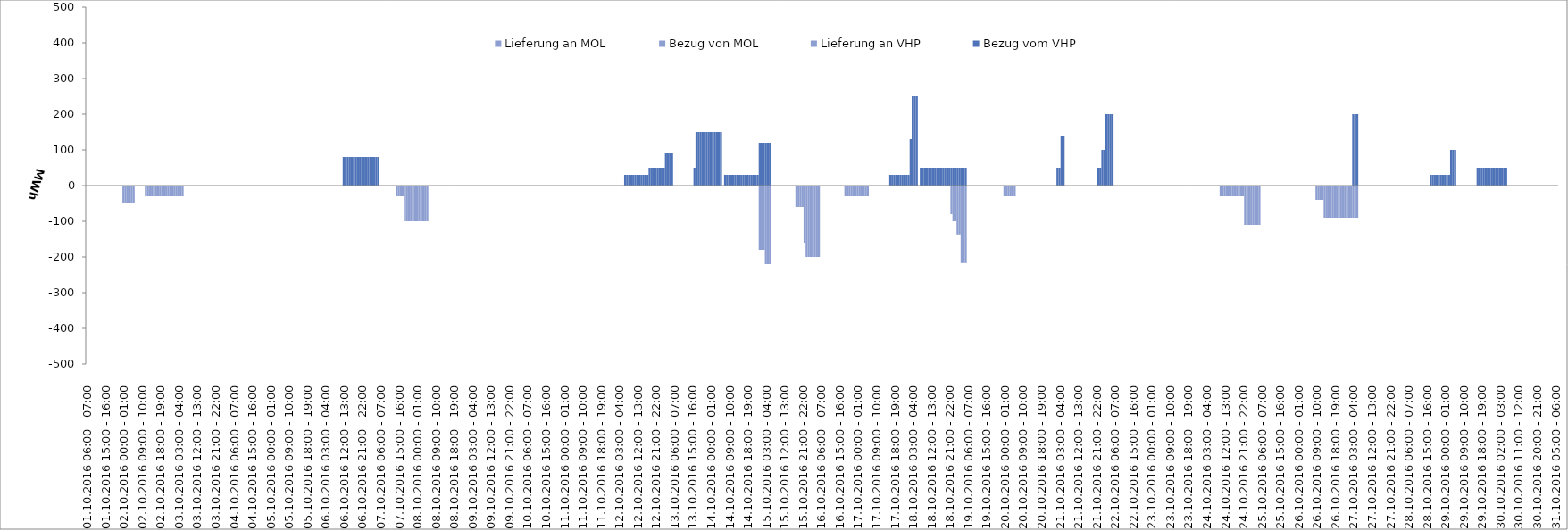
| Category | Bezug vom VHP | Lieferung an VHP | Bezug von MOL | Lieferung an MOL |
|---|---|---|---|---|
| 01.10.2016 06:00 - 07:00 | 0 | 0 | 0 | 0 |
| 01.10.2016 07:00 - 08:00 | 0 | 0 | 0 | 0 |
| 01.10.2016 08:00 - 09:00 | 0 | 0 | 0 | 0 |
| 01.10.2016 09:00 - 10:00 | 0 | 0 | 0 | 0 |
| 01.10.2016 10:00 - 11:00 | 0 | 0 | 0 | 0 |
| 01.10.2016 11:00 - 12:00 | 0 | 0 | 0 | 0 |
| 01.10.2016 12:00 - 13:00 | 0 | 0 | 0 | 0 |
| 01.10.2016 13:00 - 14:00 | 0 | 0 | 0 | 0 |
| 01.10.2016 14:00 - 15:00 | 0 | 0 | 0 | 0 |
| 01.10.2016 15:00 - 16:00 | 0 | 0 | 0 | 0 |
| 01.10.2016 16:00 - 17:00 | 0 | 0 | 0 | 0 |
| 01.10.2016 17:00 - 18:00 | 0 | 0 | 0 | 0 |
| 01.10.2016 18:00 - 19:00 | 0 | 0 | 0 | 0 |
| 01.10.2016 19:00 - 20:00 | 0 | 0 | 0 | 0 |
| 01.10.2016 20:00 - 21:00 | 0 | 0 | 0 | 0 |
| 01.10.2016 21:00 - 22:00 | 0 | 0 | 0 | 0 |
| 01.10.2016 22:00 - 23:00 | 0 | 0 | 0 | 0 |
| 01.10.2016 23:00 - 24:00 | 0 | 0 | 0 | 0 |
| 02.10.2016 00:00 - 01:00 | 0 | -50 | 0 | 0 |
| 02.10.2016 01:00 - 02:00 | 0 | -50 | 0 | 0 |
| 02.10.2016 02:00 - 03:00 | 0 | -50 | 0 | 0 |
| 02.10.2016 03:00 - 04:00 | 0 | -50 | 0 | 0 |
| 02.10.2016 04:00 - 05:00 | 0 | -50 | 0 | 0 |
| 02.10.2016 05:00 - 06:00 | 0 | -50 | 0 | 0 |
| 02.10.2016 06:00 - 07:00 | 0 | 0 | 0 | 0 |
| 02.10.2016 07:00 - 08:00 | 0 | 0 | 0 | 0 |
| 02.10.2016 08:00 - 09:00 | 0 | 0 | 0 | 0 |
| 02.10.2016 09:00 - 10:00 | 0 | 0 | 0 | 0 |
| 02.10.2016 10:00 - 11:00 | 0 | 0 | 0 | 0 |
| 02.10.2016 11:00 - 12:00 | 0 | -30 | 0 | 0 |
| 02.10.2016 12:00 - 13:00 | 0 | -30 | 0 | 0 |
| 02.10.2016 13:00 - 14:00 | 0 | -30 | 0 | 0 |
| 02.10.2016 14:00 - 15:00 | 0 | -30 | 0 | 0 |
| 02.10.2016 15:00 - 16:00 | 0 | -30 | 0 | 0 |
| 02.10.2016 16:00 - 17:00 | 0 | -30 | 0 | 0 |
| 02.10.2016 17:00 - 18:00 | 0 | -30 | 0 | 0 |
| 02.10.2016 18:00 - 19:00 | 0 | -30 | 0 | 0 |
| 02.10.2016 19:00 - 20:00 | 0 | -30 | 0 | 0 |
| 02.10.2016 20:00 - 21:00 | 0 | -30 | 0 | 0 |
| 02.10.2016 21:00 - 22:00 | 0 | -30 | 0 | 0 |
| 02.10.2016 22:00 - 23:00 | 0 | -30 | 0 | 0 |
| 02.10.2016 23:00 - 24:00 | 0 | -30 | 0 | 0 |
| 03.10.2016 00:00 - 01:00 | 0 | -30 | 0 | 0 |
| 03.10.2016 01:00 - 02:00 | 0 | -30 | 0 | 0 |
| 03.10.2016 02:00 - 03:00 | 0 | -30 | 0 | 0 |
| 03.10.2016 03:00 - 04:00 | 0 | -30 | 0 | 0 |
| 03.10.2016 04:00 - 05:00 | 0 | -30 | 0 | 0 |
| 03.10.2016 05:00 - 06:00 | 0 | -30 | 0 | 0 |
| 03.10.2016 06:00 - 07:00 | 0 | 0 | 0 | 0 |
| 03.10.2016 07:00 - 08:00 | 0 | 0 | 0 | 0 |
| 03.10.2016 08:00 - 09:00 | 0 | 0 | 0 | 0 |
| 03.10.2016 09:00 - 10:00 | 0 | 0 | 0 | 0 |
| 03.10.2016 10:00 - 11:00 | 0 | 0 | 0 | 0 |
| 03.10.2016 11:00 - 12:00 | 0 | 0 | 0 | 0 |
| 03.10.2016 12:00 - 13:00 | 0 | 0 | 0 | 0 |
| 03.10.2016 13:00 - 14:00 | 0 | 0 | 0 | 0 |
| 03.10.2016 14:00 - 15:00 | 0 | 0 | 0 | 0 |
| 03.10.2016 15:00 - 16:00 | 0 | 0 | 0 | 0 |
| 03.10.2016 16:00 - 17:00 | 0 | 0 | 0 | 0 |
| 03.10.2016 17:00 - 18:00 | 0 | 0 | 0 | 0 |
| 03.10.2016 18:00 - 19:00 | 0 | 0 | 0 | 0 |
| 03.10.2016 19:00 - 20:00 | 0 | 0 | 0 | 0 |
| 03.10.2016 20:00 - 21:00 | 0 | 0 | 0 | 0 |
| 03.10.2016 21:00 - 22:00 | 0 | 0 | 0 | 0 |
| 03.10.2016 22:00 - 23:00 | 0 | 0 | 0 | 0 |
| 03.10.2016 23:00 - 24:00 | 0 | 0 | 0 | 0 |
| 04.10.2016 00:00 - 01:00 | 0 | 0 | 0 | 0 |
| 04.10.2016 01:00 - 02:00 | 0 | 0 | 0 | 0 |
| 04.10.2016 02:00 - 03:00 | 0 | 0 | 0 | 0 |
| 04.10.2016 03:00 - 04:00 | 0 | 0 | 0 | 0 |
| 04.10.2016 04:00 - 05:00 | 0 | 0 | 0 | 0 |
| 04.10.2016 05:00 - 06:00 | 0 | 0 | 0 | 0 |
| 04.10.2016 06:00 - 07:00 | 0 | 0 | 0 | 0 |
| 04.10.2016 07:00 - 08:00 | 0 | 0 | 0 | 0 |
| 04.10.2016 08:00 - 09:00 | 0 | 0 | 0 | 0 |
| 04.10.2016 09:00 - 10:00 | 0 | 0 | 0 | 0 |
| 04.10.2016 10:00 - 11:00 | 0 | 0 | 0 | 0 |
| 04.10.2016 11:00 - 12:00 | 0 | 0 | 0 | 0 |
| 04.10.2016 12:00 - 13:00 | 0 | 0 | 0 | 0 |
| 04.10.2016 13:00 - 14:00 | 0 | 0 | 0 | 0 |
| 04.10.2016 14:00 - 15:00 | 0 | 0 | 0 | 0 |
| 04.10.2016 15:00 - 16:00 | 0 | 0 | 0 | 0 |
| 04.10.2016 16:00 - 17:00 | 0 | 0 | 0 | 0 |
| 04.10.2016 17:00 - 18:00 | 0 | 0 | 0 | 0 |
| 04.10.2016 18:00 - 19:00 | 0 | 0 | 0 | 0 |
| 04.10.2016 19:00 - 20:00 | 0 | 0 | 0 | 0 |
| 04.10.2016 20:00 - 21:00 | 0 | 0 | 0 | 0 |
| 04.10.2016 21:00 - 22:00 | 0 | 0 | 0 | 0 |
| 04.10.2016 22:00 - 23:00 | 0 | 0 | 0 | 0 |
| 04.10.2016 23:00 - 24:00 | 0 | 0 | 0 | 0 |
| 05.10.2016 00:00 - 01:00 | 0 | 0 | 0 | 0 |
| 05.10.2016 01:00 - 02:00 | 0 | 0 | 0 | 0 |
| 05.10.2016 02:00 - 03:00 | 0 | 0 | 0 | 0 |
| 05.10.2016 03:00 - 04:00 | 0 | 0 | 0 | 0 |
| 05.10.2016 04:00 - 05:00 | 0 | 0 | 0 | 0 |
| 05.10.2016 05:00 - 06:00 | 0 | 0 | 0 | 0 |
| 05.10.2016 06:00 - 07:00 | 0 | 0 | 0 | 0 |
| 05.10.2016 07:00 - 08:00 | 0 | 0 | 0 | 0 |
| 05.10.2016 08:00 - 09:00 | 0 | 0 | 0 | 0 |
| 05.10.2016 09:00 - 10:00 | 0 | 0 | 0 | 0 |
| 05.10.2016 10:00 - 11:00 | 0 | 0 | 0 | 0 |
| 05.10.2016 11:00 - 12:00 | 0 | 0 | 0 | 0 |
| 05.10.2016 12:00 - 13:00 | 0 | 0 | 0 | 0 |
| 05.10.2016 13:00 - 14:00 | 0 | 0 | 0 | 0 |
| 05.10.2016 14:00 - 15:00 | 0 | 0 | 0 | 0 |
| 05.10.2016 15:00 - 16:00 | 0 | 0 | 0 | 0 |
| 05.10.2016 16:00 - 17:00 | 0 | 0 | 0 | 0 |
| 05.10.2016 17:00 - 18:00 | 0 | 0 | 0 | 0 |
| 05.10.2016 18:00 - 19:00 | 0 | 0 | 0 | 0 |
| 05.10.2016 19:00 - 20:00 | 0 | 0 | 0 | 0 |
| 05.10.2016 20:00 - 21:00 | 0 | 0 | 0 | 0 |
| 05.10.2016 21:00 - 22:00 | 0 | 0 | 0 | 0 |
| 05.10.2016 22:00 - 23:00 | 0 | 0 | 0 | 0 |
| 05.10.2016 23:00 - 24:00 | 0 | 0 | 0 | 0 |
| 06.10.2016 00:00 - 01:00 | 0 | 0 | 0 | 0 |
| 06.10.2016 01:00 - 02:00 | 0 | 0 | 0 | 0 |
| 06.10.2016 02:00 - 03:00 | 0 | 0 | 0 | 0 |
| 06.10.2016 03:00 - 04:00 | 0 | 0 | 0 | 0 |
| 06.10.2016 04:00 - 05:00 | 0 | 0 | 0 | 0 |
| 06.10.2016 05:00 - 06:00 | 0 | 0 | 0 | 0 |
| 06.10.2016 06:00 - 07:00 | 0 | 0 | 0 | 0 |
| 06.10.2016 07:00 - 08:00 | 0 | 0 | 0 | 0 |
| 06.10.2016 08:00 - 09:00 | 0 | 0 | 0 | 0 |
| 06.10.2016 09:00 - 10:00 | 0 | 0 | 0 | 0 |
| 06.10.2016 10:00 - 11:00 | 0 | 0 | 0 | 0 |
| 06.10.2016 11:00 - 12:00 | 0 | 0 | 0 | 0 |
| 06.10.2016 12:00 - 13:00 | 80 | 0 | 0 | 0 |
| 06.10.2016 13:00 - 14:00 | 80 | 0 | 0 | 0 |
| 06.10.2016 14:00 - 15:00 | 80 | 0 | 0 | 0 |
| 06.10.2016 15:00 - 16:00 | 80 | 0 | 0 | 0 |
| 06.10.2016 16:00 - 17:00 | 80 | 0 | 0 | 0 |
| 06.10.2016 17:00 - 18:00 | 80 | 0 | 0 | 0 |
| 06.10.2016 18:00 - 19:00 | 80 | 0 | 0 | 0 |
| 06.10.2016 19:00 - 20:00 | 80 | 0 | 0 | 0 |
| 06.10.2016 20:00 - 21:00 | 80 | 0 | 0 | 0 |
| 06.10.2016 21:00 - 22:00 | 80 | 0 | 0 | 0 |
| 06.10.2016 22:00 - 23:00 | 80 | 0 | 0 | 0 |
| 06.10.2016 23:00 - 24:00 | 80 | 0 | 0 | 0 |
| 07.10.2016 00:00 - 01:00 | 80 | 0 | 0 | 0 |
| 07.10.2016 01:00 - 02:00 | 80 | 0 | 0 | 0 |
| 07.10.2016 02:00 - 03:00 | 80 | 0 | 0 | 0 |
| 07.10.2016 03:00 - 04:00 | 80 | 0 | 0 | 0 |
| 07.10.2016 04:00 - 05:00 | 80 | 0 | 0 | 0 |
| 07.10.2016 05:00 - 06:00 | 80 | 0 | 0 | 0 |
| 07.10.2016 06:00 - 07:00 | 0 | 0 | 0 | 0 |
| 07.10.2016 07:00 - 08:00 | 0 | 0 | 0 | 0 |
| 07.10.2016 08:00 - 09:00 | 0 | 0 | 0 | 0 |
| 07.10.2016 09:00 - 10:00 | 0 | 0 | 0 | 0 |
| 07.10.2016 10:00 - 11:00 | 0 | 0 | 0 | 0 |
| 07.10.2016 11:00 - 12:00 | 0 | 0 | 0 | 0 |
| 07.10.2016 12:00 - 13:00 | 0 | 0 | 0 | 0 |
| 07.10.2016 13:00 - 14:00 | 0 | 0 | 0 | 0 |
| 07.10.2016 14:00 - 15:00 | 0 | -30 | 0 | 0 |
| 07.10.2016 15:00 - 16:00 | 0 | -30 | 0 | 0 |
| 07.10.2016 16:00 - 17:00 | 0 | -30 | 0 | 0 |
| 07.10.2016 17:00 - 18:00 | 0 | -30 | 0 | 0 |
| 07.10.2016 18:00 - 19:00 | 0 | -100 | 0 | 0 |
| 07.10.2016 19:00 - 20:00 | 0 | -100 | 0 | 0 |
| 07.10.2016 20:00 - 21:00 | 0 | -100 | 0 | 0 |
| 07.10.2016 21:00 - 22:00 | 0 | -100 | 0 | 0 |
| 07.10.2016 22:00 - 23:00 | 0 | -100 | 0 | 0 |
| 07.10.2016 23:00 - 24:00 | 0 | -100 | 0 | 0 |
| 08.10.2016 00:00 - 01:00 | 0 | -100 | 0 | 0 |
| 08.10.2016 01:00 - 02:00 | 0 | -100 | 0 | 0 |
| 08.10.2016 02:00 - 03:00 | 0 | -100 | 0 | 0 |
| 08.10.2016 03:00 - 04:00 | 0 | -100 | 0 | 0 |
| 08.10.2016 04:00 - 05:00 | 0 | -100 | 0 | 0 |
| 08.10.2016 05:00 - 06:00 | 0 | -100 | 0 | 0 |
| 08.10.2016 06:00 - 07:00 | 0 | 0 | 0 | 0 |
| 08.10.2016 07:00 - 08:00 | 0 | 0 | 0 | 0 |
| 08.10.2016 08:00 - 09:00 | 0 | 0 | 0 | 0 |
| 08.10.2016 09:00 - 10:00 | 0 | 0 | 0 | 0 |
| 08.10.2016 10:00 - 11:00 | 0 | 0 | 0 | 0 |
| 08.10.2016 11:00 - 12:00 | 0 | 0 | 0 | 0 |
| 08.10.2016 12:00 - 13:00 | 0 | 0 | 0 | 0 |
| 08.10.2016 13:00 - 14:00 | 0 | 0 | 0 | 0 |
| 08.10.2016 14:00 - 15:00 | 0 | 0 | 0 | 0 |
| 08.10.2016 15:00 - 16:00 | 0 | 0 | 0 | 0 |
| 08.10.2016 16:00 - 17:00 | 0 | 0 | 0 | 0 |
| 08.10.2016 17:00 - 18:00 | 0 | 0 | 0 | 0 |
| 08.10.2016 18:00 - 19:00 | 0 | 0 | 0 | 0 |
| 08.10.2016 19:00 - 20:00 | 0 | 0 | 0 | 0 |
| 08.10.2016 20:00 - 21:00 | 0 | 0 | 0 | 0 |
| 08.10.2016 21:00 - 22:00 | 0 | 0 | 0 | 0 |
| 08.10.2016 22:00 - 23:00 | 0 | 0 | 0 | 0 |
| 08.10.2016 23:00 - 24:00 | 0 | 0 | 0 | 0 |
| 09.10.2016 00:00 - 01:00 | 0 | 0 | 0 | 0 |
| 09.10.2016 01:00 - 02:00 | 0 | 0 | 0 | 0 |
| 09.10.2016 02:00 - 03:00 | 0 | 0 | 0 | 0 |
| 09.10.2016 03:00 - 04:00 | 0 | 0 | 0 | 0 |
| 09.10.2016 04:00 - 05:00 | 0 | 0 | 0 | 0 |
| 09.10.2016 05:00 - 06:00 | 0 | 0 | 0 | 0 |
| 09.10.2016 06:00 - 07:00 | 0 | 0 | 0 | 0 |
| 09.10.2016 07:00 - 08:00 | 0 | 0 | 0 | 0 |
| 09.10.2016 08:00 - 09:00 | 0 | 0 | 0 | 0 |
| 09.10.2016 09:00 - 10:00 | 0 | 0 | 0 | 0 |
| 09.10.2016 10:00 - 11:00 | 0 | 0 | 0 | 0 |
| 09.10.2016 11:00 - 12:00 | 0 | 0 | 0 | 0 |
| 09.10.2016 12:00 - 13:00 | 0 | 0 | 0 | 0 |
| 09.10.2016 13:00 - 14:00 | 0 | 0 | 0 | 0 |
| 09.10.2016 14:00 - 15:00 | 0 | 0 | 0 | 0 |
| 09.10.2016 15:00 - 16:00 | 0 | 0 | 0 | 0 |
| 09.10.2016 16:00 - 17:00 | 0 | 0 | 0 | 0 |
| 09.10.2016 17:00 - 18:00 | 0 | 0 | 0 | 0 |
| 09.10.2016 18:00 - 19:00 | 0 | 0 | 0 | 0 |
| 09.10.2016 19:00 - 20:00 | 0 | 0 | 0 | 0 |
| 09.10.2016 20:00 - 21:00 | 0 | 0 | 0 | 0 |
| 09.10.2016 21:00 - 22:00 | 0 | 0 | 0 | 0 |
| 09.10.2016 22:00 - 23:00 | 0 | 0 | 0 | 0 |
| 09.10.2016 23:00 - 24:00 | 0 | 0 | 0 | 0 |
| 10.10.2016 00:00 - 01:00 | 0 | 0 | 0 | 0 |
| 10.10.2016 01:00 - 02:00 | 0 | 0 | 0 | 0 |
| 10.10.2016 02:00 - 03:00 | 0 | 0 | 0 | 0 |
| 10.10.2016 03:00 - 04:00 | 0 | 0 | 0 | 0 |
| 10.10.2016 04:00 - 05:00 | 0 | 0 | 0 | 0 |
| 10.10.2016 05:00 - 06:00 | 0 | 0 | 0 | 0 |
| 10.10.2016 06:00 - 07:00 | 0 | 0 | 0 | 0 |
| 10.10.2016 07:00 - 08:00 | 0 | 0 | 0 | 0 |
| 10.10.2016 08:00 - 09:00 | 0 | 0 | 0 | 0 |
| 10.10.2016 09:00 - 10:00 | 0 | 0 | 0 | 0 |
| 10.10.2016 10:00 - 11:00 | 0 | 0 | 0 | 0 |
| 10.10.2016 11:00 - 12:00 | 0 | 0 | 0 | 0 |
| 10.10.2016 12:00 - 13:00 | 0 | 0 | 0 | 0 |
| 10.10.2016 13:00 - 14:00 | 0 | 0 | 0 | 0 |
| 10.10.2016 14:00 - 15:00 | 0 | 0 | 0 | 0 |
| 10.10.2016 15:00 - 16:00 | 0 | 0 | 0 | 0 |
| 10.10.2016 16:00 - 17:00 | 0 | 0 | 0 | 0 |
| 10.10.2016 17:00 - 18:00 | 0 | 0 | 0 | 0 |
| 10.10.2016 18:00 - 19:00 | 0 | 0 | 0 | 0 |
| 10.10.2016 19:00 - 20:00 | 0 | 0 | 0 | 0 |
| 10.10.2016 20:00 - 21:00 | 0 | 0 | 0 | 0 |
| 10.10.2016 21:00 - 22:00 | 0 | 0 | 0 | 0 |
| 10.10.2016 22:00 - 23:00 | 0 | 0 | 0 | 0 |
| 10.10.2016 23:00 - 24:00 | 0 | 0 | 0 | 0 |
| 11.10.2016 00:00 - 01:00 | 0 | 0 | 0 | 0 |
| 11.10.2016 01:00 - 02:00 | 0 | 0 | 0 | 0 |
| 11.10.2016 02:00 - 03:00 | 0 | 0 | 0 | 0 |
| 11.10.2016 03:00 - 04:00 | 0 | 0 | 0 | 0 |
| 11.10.2016 04:00 - 05:00 | 0 | 0 | 0 | 0 |
| 11.10.2016 05:00 - 06:00 | 0 | 0 | 0 | 0 |
| 11.10.2016 06:00 - 07:00 | 0 | 0 | 0 | 0 |
| 11.10.2016 07:00 - 08:00 | 0 | 0 | 0 | 0 |
| 11.10.2016 08:00 - 09:00 | 0 | 0 | 0 | 0 |
| 11.10.2016 09:00 - 10:00 | 0 | 0 | 0 | 0 |
| 11.10.2016 10:00 - 11:00 | 0 | 0 | 0 | 0 |
| 11.10.2016 11:00 - 12:00 | 0 | 0 | 0 | 0 |
| 11.10.2016 12:00 - 13:00 | 0 | 0 | 0 | 0 |
| 11.10.2016 13:00 - 14:00 | 0 | 0 | 0 | 0 |
| 11.10.2016 14:00 - 15:00 | 0 | 0 | 0 | 0 |
| 11.10.2016 15:00 - 16:00 | 0 | 0 | 0 | 0 |
| 11.10.2016 16:00 - 17:00 | 0 | 0 | 0 | 0 |
| 11.10.2016 17:00 - 18:00 | 0 | 0 | 0 | 0 |
| 11.10.2016 18:00 - 19:00 | 0 | 0 | 0 | 0 |
| 11.10.2016 19:00 - 20:00 | 0 | 0 | 0 | 0 |
| 11.10.2016 20:00 - 21:00 | 0 | 0 | 0 | 0 |
| 11.10.2016 21:00 - 22:00 | 0 | 0 | 0 | 0 |
| 11.10.2016 22:00 - 23:00 | 0 | 0 | 0 | 0 |
| 11.10.2016 23:00 - 24:00 | 0 | 0 | 0 | 0 |
| 12.10.2016 00:00 - 01:00 | 0 | 0 | 0 | 0 |
| 12.10.2016 01:00 - 02:00 | 0 | 0 | 0 | 0 |
| 12.10.2016 02:00 - 03:00 | 0 | 0 | 0 | 0 |
| 12.10.2016 03:00 - 04:00 | 0 | 0 | 0 | 0 |
| 12.10.2016 04:00 - 05:00 | 0 | 0 | 0 | 0 |
| 12.10.2016 05:00 - 06:00 | 0 | 0 | 0 | 0 |
| 12.10.2016 06:00 - 07:00 | 30 | 0 | 0 | 0 |
| 12.10.2016 07:00 - 08:00 | 30 | 0 | 0 | 0 |
| 12.10.2016 08:00 - 09:00 | 30 | 0 | 0 | 0 |
| 12.10.2016 09:00 - 10:00 | 30 | 0 | 0 | 0 |
| 12.10.2016 10:00 - 11:00 | 30 | 0 | 0 | 0 |
| 12.10.2016 11:00 - 12:00 | 30 | 0 | 0 | 0 |
| 12.10.2016 12:00 - 13:00 | 30 | 0 | 0 | 0 |
| 12.10.2016 13:00 - 14:00 | 30 | 0 | 0 | 0 |
| 12.10.2016 14:00 - 15:00 | 30 | 0 | 0 | 0 |
| 12.10.2016 15:00 - 16:00 | 30 | 0 | 0 | 0 |
| 12.10.2016 16:00 - 17:00 | 30 | 0 | 0 | 0 |
| 12.10.2016 17:00 - 18:00 | 30 | 0 | 0 | 0 |
| 12.10.2016 18:00 - 19:00 | 50 | 0 | 0 | 0 |
| 12.10.2016 19:00 - 20:00 | 50 | 0 | 0 | 0 |
| 12.10.2016 20:00 - 21:00 | 50 | 0 | 0 | 0 |
| 12.10.2016 21:00 - 22:00 | 50 | 0 | 0 | 0 |
| 12.10.2016 22:00 - 23:00 | 50 | 0 | 0 | 0 |
| 12.10.2016 23:00 - 24:00 | 50 | 0 | 0 | 0 |
| 13.10.2016 00:00 - 01:00 | 50 | 0 | 0 | 0 |
| 13.10.2016 01:00 - 02:00 | 50 | 0 | 0 | 0 |
| 13.10.2016 02:00 - 03:00 | 90 | 0 | 0 | 0 |
| 13.10.2016 03:00 - 04:00 | 90 | 0 | 0 | 0 |
| 13.10.2016 04:00 - 05:00 | 90 | 0 | 0 | 0 |
| 13.10.2016 05:00 - 06:00 | 90 | 0 | 0 | 0 |
| 13.10.2016 06:00 - 07:00 | 0 | 0 | 0 | 0 |
| 13.10.2016 07:00 - 08:00 | 0 | 0 | 0 | 0 |
| 13.10.2016 08:00 - 09:00 | 0 | 0 | 0 | 0 |
| 13.10.2016 09:00 - 10:00 | 0 | 0 | 0 | 0 |
| 13.10.2016 10:00 - 11:00 | 0 | 0 | 0 | 0 |
| 13.10.2016 11:00 - 12:00 | 0 | 0 | 0 | 0 |
| 13.10.2016 12:00 - 13:00 | 0 | 0 | 0 | 0 |
| 13.10.2016 13:00 - 14:00 | 0 | 0 | 0 | 0 |
| 13.10.2016 14:00 - 15:00 | 0 | 0 | 0 | 0 |
| 13.10.2016 15:00 - 16:00 | 0 | 0 | 0 | 0 |
| 13.10.2016 16:00 - 17:00 | 50 | 0 | 0 | 0 |
| 13.10.2016 17:00 - 18:00 | 150 | 0 | 0 | 0 |
| 13.10.2016 18:00 - 19:00 | 150 | 0 | 0 | 0 |
| 13.10.2016 19:00 - 20:00 | 150 | 0 | 0 | 0 |
| 13.10.2016 20:00 - 21:00 | 150 | 0 | 0 | 0 |
| 13.10.2016 21:00 - 22:00 | 150 | 0 | 0 | 0 |
| 13.10.2016 22:00 - 23:00 | 150 | 0 | 0 | 0 |
| 13.10.2016 23:00 - 24:00 | 150 | 0 | 0 | 0 |
| 14.10.2016 00:00 - 01:00 | 150 | 0 | 0 | 0 |
| 14.10.2016 01:00 - 02:00 | 150 | 0 | 0 | 0 |
| 14.10.2016 02:00 - 03:00 | 150 | 0 | 0 | 0 |
| 14.10.2016 03:00 - 04:00 | 150 | 0 | 0 | 0 |
| 14.10.2016 04:00 - 05:00 | 150 | 0 | 0 | 0 |
| 14.10.2016 05:00 - 06:00 | 150 | 0 | 0 | 0 |
| 14.10.2016 06:00 - 07:00 | 0 | 0 | 0 | 0 |
| 14.10.2016 07:00 - 08:00 | 30 | 0 | 0 | 0 |
| 14.10.2016 08:00 - 09:00 | 30 | 0 | 0 | 0 |
| 14.10.2016 09:00 - 10:00 | 30 | 0 | 0 | 0 |
| 14.10.2016 10:00 - 11:00 | 30 | 0 | 0 | 0 |
| 14.10.2016 11:00 - 12:00 | 30 | 0 | 0 | 0 |
| 14.10.2016 12:00 - 13:00 | 30 | 0 | 0 | 0 |
| 14.10.2016 13:00 - 14:00 | 30 | 0 | 0 | 0 |
| 14.10.2016 14:00 - 15:00 | 30 | 0 | 0 | 0 |
| 14.10.2016 15:00 - 16:00 | 30 | 0 | 0 | 0 |
| 14.10.2016 16:00 - 17:00 | 30 | 0 | 0 | 0 |
| 14.10.2016 17:00 - 18:00 | 30 | 0 | 0 | 0 |
| 14.10.2016 18:00 - 19:00 | 30 | 0 | 0 | 0 |
| 14.10.2016 19:00 - 20:00 | 30 | 0 | 0 | 0 |
| 14.10.2016 20:00 - 21:00 | 30 | 0 | 0 | 0 |
| 14.10.2016 21:00 - 22:00 | 30 | 0 | 0 | 0 |
| 14.10.2016 22:00 - 23:00 | 30 | 0 | 0 | 0 |
| 14.10.2016 23:00 - 24:00 | 30 | 0 | 0 | 0 |
| 15.10.2016 00:00 - 01:00 | 120 | -180 | 0 | 0 |
| 15.10.2016 01:00 - 02:00 | 120 | -180 | 0 | 0 |
| 15.10.2016 02:00 - 03:00 | 120 | -180 | 0 | 0 |
| 15.10.2016 03:00 - 04:00 | 120 | -220 | 0 | 0 |
| 15.10.2016 04:00 - 05:00 | 120 | -220 | 0 | 0 |
| 15.10.2016 05:00 - 06:00 | 120 | -220 | 0 | 0 |
| 15.10.2016 06:00 - 07:00 | 0 | 0 | 0 | 0 |
| 15.10.2016 07:00 - 08:00 | 0 | 0 | 0 | 0 |
| 15.10.2016 08:00 - 09:00 | 0 | 0 | 0 | 0 |
| 15.10.2016 09:00 - 10:00 | 0 | 0 | 0 | 0 |
| 15.10.2016 10:00 - 11:00 | 0 | 0 | 0 | 0 |
| 15.10.2016 11:00 - 12:00 | 0 | 0 | 0 | 0 |
| 15.10.2016 12:00 - 13:00 | 0 | 0 | 0 | 0 |
| 15.10.2016 13:00 - 14:00 | 0 | 0 | 0 | 0 |
| 15.10.2016 14:00 - 15:00 | 0 | 0 | 0 | 0 |
| 15.10.2016 15:00 - 16:00 | 0 | 0 | 0 | 0 |
| 15.10.2016 16:00 - 17:00 | 0 | 0 | 0 | 0 |
| 15.10.2016 17:00 - 18:00 | 0 | 0 | 0 | 0 |
| 15.10.2016 18:00 - 19:00 | 0 | -60 | 0 | 0 |
| 15.10.2016 19:00 - 20:00 | 0 | -60 | 0 | 0 |
| 15.10.2016 20:00 - 21:00 | 0 | -60 | 0 | 0 |
| 15.10.2016 21:00 - 22:00 | 0 | -60 | 0 | 0 |
| 15.10.2016 22:00 - 23:00 | 0 | -160 | 0 | 0 |
| 15.10.2016 23:00 - 24:00 | 0 | -200 | 0 | 0 |
| 16.10.2016 00:00 - 01:00 | 0 | -200 | 0 | 0 |
| 16.10.2016 01:00 - 02:00 | 0 | -200 | 0 | 0 |
| 16.10.2016 02:00 - 03:00 | 0 | -200 | 0 | 0 |
| 16.10.2016 03:00 - 04:00 | 0 | -200 | 0 | 0 |
| 16.10.2016 04:00 - 05:00 | 0 | -200 | 0 | 0 |
| 16.10.2016 05:00 - 06:00 | 0 | -200 | 0 | 0 |
| 16.10.2016 06:00 - 07:00 | 0 | 0 | 0 | 0 |
| 16.10.2016 07:00 - 08:00 | 0 | 0 | 0 | 0 |
| 16.10.2016 08:00 - 09:00 | 0 | 0 | 0 | 0 |
| 16.10.2016 09:00 - 10:00 | 0 | 0 | 0 | 0 |
| 16.10.2016 10:00 - 11:00 | 0 | 0 | 0 | 0 |
| 16.10.2016 11:00 - 12:00 | 0 | 0 | 0 | 0 |
| 16.10.2016 12:00 - 13:00 | 0 | 0 | 0 | 0 |
| 16.10.2016 13:00 - 14:00 | 0 | 0 | 0 | 0 |
| 16.10.2016 14:00 - 15:00 | 0 | 0 | 0 | 0 |
| 16.10.2016 15:00 - 16:00 | 0 | 0 | 0 | 0 |
| 16.10.2016 16:00 - 17:00 | 0 | 0 | 0 | 0 |
| 16.10.2016 17:00 - 18:00 | 0 | 0 | 0 | 0 |
| 16.10.2016 18:00 - 19:00 | 0 | -30 | 0 | 0 |
| 16.10.2016 19:00 - 20:00 | 0 | -30 | 0 | 0 |
| 16.10.2016 20:00 - 21:00 | 0 | -30 | 0 | 0 |
| 16.10.2016 21:00 - 22:00 | 0 | -30 | 0 | 0 |
| 16.10.2016 22:00 - 23:00 | 0 | -30 | 0 | 0 |
| 16.10.2016 23:00 - 24:00 | 0 | -30 | 0 | 0 |
| 17.10.2016 00:00 - 01:00 | 0 | -30 | 0 | 0 |
| 17.10.2016 01:00 - 02:00 | 0 | -30 | 0 | 0 |
| 17.10.2016 02:00 - 03:00 | 0 | -30 | 0 | 0 |
| 17.10.2016 03:00 - 04:00 | 0 | -30 | 0 | 0 |
| 17.10.2016 04:00 - 05:00 | 0 | -30 | 0 | 0 |
| 17.10.2016 05:00 - 06:00 | 0 | -30 | 0 | 0 |
| 17.10.2016 06:00 - 07:00 | 0 | 0 | 0 | 0 |
| 17.10.2016 07:00 - 08:00 | 0 | 0 | 0 | 0 |
| 17.10.2016 08:00 - 09:00 | 0 | 0 | 0 | 0 |
| 17.10.2016 09:00 - 10:00 | 0 | 0 | 0 | 0 |
| 17.10.2016 10:00 - 11:00 | 0 | 0 | 0 | 0 |
| 17.10.2016 11:00 - 12:00 | 0 | 0 | 0 | 0 |
| 17.10.2016 12:00 - 13:00 | 0 | 0 | 0 | 0 |
| 17.10.2016 13:00 - 14:00 | 0 | 0 | 0 | 0 |
| 17.10.2016 14:00 - 15:00 | 0 | 0 | 0 | 0 |
| 17.10.2016 15:00 - 16:00 | 0 | 0 | 0 | 0 |
| 17.10.2016 16:00 - 17:00 | 30 | 0 | 0 | 0 |
| 17.10.2016 17:00 - 18:00 | 30 | 0 | 0 | 0 |
| 17.10.2016 18:00 - 19:00 | 30 | 0 | 0 | 0 |
| 17.10.2016 19:00 - 20:00 | 30 | 0 | 0 | 0 |
| 17.10.2016 20:00 - 21:00 | 30 | 0 | 0 | 0 |
| 17.10.2016 21:00 - 22:00 | 30 | 0 | 0 | 0 |
| 17.10.2016 22:00 - 23:00 | 30 | 0 | 0 | 0 |
| 17.10.2016 23:00 - 24:00 | 30 | 0 | 0 | 0 |
| 18.10.2016 00:00 - 01:00 | 30 | 0 | 0 | 0 |
| 18.10.2016 01:00 - 02:00 | 30 | 0 | 0 | 0 |
| 18.10.2016 02:00 - 03:00 | 130 | 0 | 0 | 0 |
| 18.10.2016 03:00 - 04:00 | 250 | 0 | 0 | 0 |
| 18.10.2016 04:00 - 05:00 | 250 | 0 | 0 | 0 |
| 18.10.2016 05:00 - 06:00 | 250 | 0 | 0 | 0 |
| 18.10.2016 06:00 - 07:00 | 0 | 0 | 0 | 0 |
| 18.10.2016 07:00 - 08:00 | 50 | 0 | 0 | 0 |
| 18.10.2016 08:00 - 09:00 | 50 | 0 | 0 | 0 |
| 18.10.2016 09:00 - 10:00 | 50 | 0 | 0 | 0 |
| 18.10.2016 10:00 - 11:00 | 50 | 0 | 0 | 0 |
| 18.10.2016 11:00 - 12:00 | 50 | 0 | 0 | 0 |
| 18.10.2016 12:00 - 13:00 | 50 | 0 | 0 | 0 |
| 18.10.2016 13:00 - 14:00 | 50 | 0 | 0 | 0 |
| 18.10.2016 14:00 - 15:00 | 50 | 0 | 0 | 0 |
| 18.10.2016 15:00 - 16:00 | 50 | 0 | 0 | 0 |
| 18.10.2016 16:00 - 17:00 | 50 | 0 | 0 | 0 |
| 18.10.2016 17:00 - 18:00 | 50 | 0 | 0 | 0 |
| 18.10.2016 18:00 - 19:00 | 50 | 0 | 0 | 0 |
| 18.10.2016 19:00 - 20:00 | 50 | 0 | 0 | 0 |
| 18.10.2016 20:00 - 21:00 | 50 | 0 | 0 | 0 |
| 18.10.2016 21:00 - 22:00 | 50 | 0 | 0 | 0 |
| 18.10.2016 22:00 - 23:00 | 50 | -80 | 0 | 0 |
| 18.10.2016 23:00 - 24:00 | 50 | -100 | 0 | 0 |
| 19.10.2016 00:00 - 01:00 | 50 | -100 | 0 | 0 |
| 19.10.2016 01:00 - 02:00 | 50 | -137 | 0 | 0 |
| 19.10.2016 02:00 - 03:00 | 50 | -137 | 0 | 0 |
| 19.10.2016 03:00 - 04:00 | 50 | -217 | 0 | 0 |
| 19.10.2016 04:00 - 05:00 | 50 | -217 | 0 | 0 |
| 19.10.2016 05:00 - 06:00 | 50 | -217 | 0 | 0 |
| 19.10.2016 06:00 - 07:00 | 0 | 0 | 0 | 0 |
| 19.10.2016 07:00 - 08:00 | 0 | 0 | 0 | 0 |
| 19.10.2016 08:00 - 09:00 | 0 | 0 | 0 | 0 |
| 19.10.2016 09:00 - 10:00 | 0 | 0 | 0 | 0 |
| 19.10.2016 10:00 - 11:00 | 0 | 0 | 0 | 0 |
| 19.10.2016 11:00 - 12:00 | 0 | 0 | 0 | 0 |
| 19.10.2016 12:00 - 13:00 | 0 | 0 | 0 | 0 |
| 19.10.2016 13:00 - 14:00 | 0 | 0 | 0 | 0 |
| 19.10.2016 14:00 - 15:00 | 0 | 0 | 0 | 0 |
| 19.10.2016 15:00 - 16:00 | 0 | 0 | 0 | 0 |
| 19.10.2016 16:00 - 17:00 | 0 | 0 | 0 | 0 |
| 19.10.2016 17:00 - 18:00 | 0 | 0 | 0 | 0 |
| 19.10.2016 18:00 - 19:00 | 0 | 0 | 0 | 0 |
| 19.10.2016 19:00 - 20:00 | 0 | 0 | 0 | 0 |
| 19.10.2016 20:00 - 21:00 | 0 | 0 | 0 | 0 |
| 19.10.2016 21:00 - 22:00 | 0 | 0 | 0 | 0 |
| 19.10.2016 22:00 - 23:00 | 0 | 0 | 0 | 0 |
| 19.10.2016 23:00 - 24:00 | 0 | 0 | 0 | 0 |
| 20.10.2016 00:00 - 01:00 | 0 | -30 | 0 | 0 |
| 20.10.2016 01:00 - 02:00 | 0 | -30 | 0 | 0 |
| 20.10.2016 02:00 - 03:00 | 0 | -30 | 0 | 0 |
| 20.10.2016 03:00 - 04:00 | 0 | -30 | 0 | 0 |
| 20.10.2016 04:00 - 05:00 | 0 | -30 | 0 | 0 |
| 20.10.2016 05:00 - 06:00 | 0 | -30 | 0 | 0 |
| 20.10.2016 06:00 - 07:00 | 0 | 0 | 0 | 0 |
| 20.10.2016 07:00 - 08:00 | 0 | 0 | 0 | 0 |
| 20.10.2016 08:00 - 09:00 | 0 | 0 | 0 | 0 |
| 20.10.2016 09:00 - 10:00 | 0 | 0 | 0 | 0 |
| 20.10.2016 10:00 - 11:00 | 0 | 0 | 0 | 0 |
| 20.10.2016 11:00 - 12:00 | 0 | 0 | 0 | 0 |
| 20.10.2016 12:00 - 13:00 | 0 | 0 | 0 | 0 |
| 20.10.2016 13:00 - 14:00 | 0 | 0 | 0 | 0 |
| 20.10.2016 14:00 - 15:00 | 0 | 0 | 0 | 0 |
| 20.10.2016 15:00 - 16:00 | 0 | 0 | 0 | 0 |
| 20.10.2016 16:00 - 17:00 | 0 | 0 | 0 | 0 |
| 20.10.2016 17:00 - 18:00 | 0 | 0 | 0 | 0 |
| 20.10.2016 18:00 - 19:00 | 0 | 0 | 0 | 0 |
| 20.10.2016 19:00 - 20:00 | 0 | 0 | 0 | 0 |
| 20.10.2016 20:00 - 21:00 | 0 | 0 | 0 | 0 |
| 20.10.2016 21:00 - 22:00 | 0 | 0 | 0 | 0 |
| 20.10.2016 22:00 - 23:00 | 0 | 0 | 0 | 0 |
| 20.10.2016 23:00 - 24:00 | 0 | 0 | 0 | 0 |
| 21.10.2016 00:00 - 01:00 | 0 | 0 | 0 | 0 |
| 21.10.2016 01:00 - 02:00 | 0 | 0 | 0 | 0 |
| 21.10.2016 02:00 - 03:00 | 50 | 0 | 0 | 0 |
| 21.10.2016 03:00 - 04:00 | 50 | 0 | 0 | 0 |
| 21.10.2016 04:00 - 05:00 | 140 | 0 | 0 | 0 |
| 21.10.2016 05:00 - 06:00 | 140 | 0 | 0 | 0 |
| 21.10.2016 06:00 - 07:00 | 0 | 0 | 0 | 0 |
| 21.10.2016 07:00 - 08:00 | 0 | 0 | 0 | 0 |
| 21.10.2016 08:00 - 09:00 | 0 | 0 | 0 | 0 |
| 21.10.2016 09:00 - 10:00 | 0 | 0 | 0 | 0 |
| 21.10.2016 10:00 - 11:00 | 0 | 0 | 0 | 0 |
| 21.10.2016 11:00 - 12:00 | 0 | 0 | 0 | 0 |
| 21.10.2016 12:00 - 13:00 | 0 | 0 | 0 | 0 |
| 21.10.2016 13:00 - 14:00 | 0 | 0 | 0 | 0 |
| 21.10.2016 14:00 - 15:00 | 0 | 0 | 0 | 0 |
| 21.10.2016 15:00 - 16:00 | 0 | 0 | 0 | 0 |
| 21.10.2016 16:00 - 17:00 | 0 | 0 | 0 | 0 |
| 21.10.2016 17:00 - 18:00 | 0 | 0 | 0 | 0 |
| 21.10.2016 18:00 - 19:00 | 0 | 0 | 0 | 0 |
| 21.10.2016 19:00 - 20:00 | 0 | 0 | 0 | 0 |
| 21.10.2016 20:00 - 21:00 | 0 | 0 | 0 | 0 |
| 21.10.2016 21:00 - 22:00 | 0 | 0 | 0 | 0 |
| 21.10.2016 22:00 - 23:00 | 50 | 0 | 0 | 0 |
| 21.10.2016 23:00 - 24:00 | 50 | 0 | 0 | 0 |
| 22.10.2016 00:00 - 01:00 | 100 | 0 | 0 | 0 |
| 22.10.2016 01:00 - 02:00 | 100 | 0 | 0 | 0 |
| 22.10.2016 02:00 - 03:00 | 200 | 0 | 0 | 0 |
| 22.10.2016 03:00 - 04:00 | 200 | 0 | 0 | 0 |
| 22.10.2016 04:00 - 05:00 | 200 | 0 | 0 | 0 |
| 22.10.2016 05:00 - 06:00 | 200 | 0 | 0 | 0 |
| 22.10.2016 06:00 - 07:00 | 0 | 0 | 0 | 0 |
| 22.10.2016 07:00 - 08:00 | 0 | 0 | 0 | 0 |
| 22.10.2016 08:00 - 09:00 | 0 | 0 | 0 | 0 |
| 22.10.2016 09:00 - 10:00 | 0 | 0 | 0 | 0 |
| 22.10.2016 10:00 - 11:00 | 0 | 0 | 0 | 0 |
| 22.10.2016 11:00 - 12:00 | 0 | 0 | 0 | 0 |
| 22.10.2016 12:00 - 13:00 | 0 | 0 | 0 | 0 |
| 22.10.2016 13:00 - 14:00 | 0 | 0 | 0 | 0 |
| 22.10.2016 14:00 - 15:00 | 0 | 0 | 0 | 0 |
| 22.10.2016 15:00 - 16:00 | 0 | 0 | 0 | 0 |
| 22.10.2016 16:00 - 17:00 | 0 | 0 | 0 | 0 |
| 22.10.2016 17:00 - 18:00 | 0 | 0 | 0 | 0 |
| 22.10.2016 18:00 - 19:00 | 0 | 0 | 0 | 0 |
| 22.10.2016 19:00 - 20:00 | 0 | 0 | 0 | 0 |
| 22.10.2016 20:00 - 21:00 | 0 | 0 | 0 | 0 |
| 22.10.2016 21:00 - 22:00 | 0 | 0 | 0 | 0 |
| 22.10.2016 22:00 - 23:00 | 0 | 0 | 0 | 0 |
| 22.10.2016 23:00 - 24:00 | 0 | 0 | 0 | 0 |
| 23.10.2016 00:00 - 01:00 | 0 | 0 | 0 | 0 |
| 23.10.2016 01:00 - 02:00 | 0 | 0 | 0 | 0 |
| 23.10.2016 02:00 - 03:00 | 0 | 0 | 0 | 0 |
| 23.10.2016 03:00 - 04:00 | 0 | 0 | 0 | 0 |
| 23.10.2016 04:00 - 05:00 | 0 | 0 | 0 | 0 |
| 23.10.2016 05:00 - 06:00 | 0 | 0 | 0 | 0 |
| 23.10.2016 06:00 - 07:00 | 0 | 0 | 0 | 0 |
| 23.10.2016 07:00 - 08:00 | 0 | 0 | 0 | 0 |
| 23.10.2016 08:00 - 09:00 | 0 | 0 | 0 | 0 |
| 23.10.2016 09:00 - 10:00 | 0 | 0 | 0 | 0 |
| 23.10.2016 10:00 - 11:00 | 0 | 0 | 0 | 0 |
| 23.10.2016 11:00 - 12:00 | 0 | 0 | 0 | 0 |
| 23.10.2016 12:00 - 13:00 | 0 | 0 | 0 | 0 |
| 23.10.2016 13:00 - 14:00 | 0 | 0 | 0 | 0 |
| 23.10.2016 14:00 - 15:00 | 0 | 0 | 0 | 0 |
| 23.10.2016 15:00 - 16:00 | 0 | 0 | 0 | 0 |
| 23.10.2016 16:00 - 17:00 | 0 | 0 | 0 | 0 |
| 23.10.2016 17:00 - 18:00 | 0 | 0 | 0 | 0 |
| 23.10.2016 18:00 - 19:00 | 0 | 0 | 0 | 0 |
| 23.10.2016 19:00 - 20:00 | 0 | 0 | 0 | 0 |
| 23.10.2016 20:00 - 21:00 | 0 | 0 | 0 | 0 |
| 23.10.2016 21:00 - 22:00 | 0 | 0 | 0 | 0 |
| 23.10.2016 22:00 - 23:00 | 0 | 0 | 0 | 0 |
| 23.10.2016 23:00 - 24:00 | 0 | 0 | 0 | 0 |
| 24.10.2016 00:00 - 01:00 | 0 | 0 | 0 | 0 |
| 24.10.2016 01:00 - 02:00 | 0 | 0 | 0 | 0 |
| 24.10.2016 02:00 - 03:00 | 0 | 0 | 0 | 0 |
| 24.10.2016 03:00 - 04:00 | 0 | 0 | 0 | 0 |
| 24.10.2016 04:00 - 05:00 | 0 | 0 | 0 | 0 |
| 24.10.2016 05:00 - 06:00 | 0 | 0 | 0 | 0 |
| 24.10.2016 06:00 - 07:00 | 0 | 0 | 0 | 0 |
| 24.10.2016 07:00 - 08:00 | 0 | 0 | 0 | 0 |
| 24.10.2016 08:00 - 09:00 | 0 | 0 | 0 | 0 |
| 24.10.2016 09:00 - 10:00 | 0 | 0 | 0 | 0 |
| 24.10.2016 10:00 - 11:00 | 0 | -30 | 0 | 0 |
| 24.10.2016 11:00 - 12:00 | 0 | -30 | 0 | 0 |
| 24.10.2016 12:00 - 13:00 | 0 | -30 | 0 | 0 |
| 24.10.2016 13:00 - 14:00 | 0 | -30 | 0 | 0 |
| 24.10.2016 14:00 - 15:00 | 0 | -30 | 0 | 0 |
| 24.10.2016 15:00 - 16:00 | 0 | -30 | 0 | 0 |
| 24.10.2016 16:00 - 17:00 | 0 | -30 | 0 | 0 |
| 24.10.2016 17:00 - 18:00 | 0 | -30 | 0 | 0 |
| 24.10.2016 18:00 - 19:00 | 0 | -30 | 0 | 0 |
| 24.10.2016 19:00 - 20:00 | 0 | -30 | 0 | 0 |
| 24.10.2016 20:00 - 21:00 | 0 | -30 | 0 | 0 |
| 24.10.2016 21:00 - 22:00 | 0 | -30 | 0 | 0 |
| 24.10.2016 22:00 - 23:00 | 0 | -110 | 0 | 0 |
| 24.10.2016 23:00 - 24:00 | 0 | -110 | 0 | 0 |
| 25.10.2016 00:00 - 01:00 | 0 | -110 | 0 | 0 |
| 25.10.2016 01:00 - 02:00 | 0 | -110 | 0 | 0 |
| 25.10.2016 02:00 - 02:00 | 0 | -110 | 0 | 0 |
| 25.10.2016 03:00 - 04:00 | 0 | -110 | 0 | 0 |
| 25.10.2016 04:00 - 05:00 | 0 | -110 | 0 | 0 |
| 25.10.2016 05:00 - 06:00 | 0 | -110 | 0 | 0 |
| 25.10.2016 06:00 - 07:00 | 0 | 0 | 0 | 0 |
| 25.10.2016 07:00 - 08:00 | 0 | 0 | 0 | 0 |
| 25.10.2016 08:00 - 09:00 | 0 | 0 | 0 | 0 |
| 25.10.2016 09:00 - 10:00 | 0 | 0 | 0 | 0 |
| 25.10.2016 10:00 - 11:00 | 0 | 0 | 0 | 0 |
| 25.10.2016 11:00 - 12:00 | 0 | 0 | 0 | 0 |
| 25.10.2016 12:00 - 13:00 | 0 | 0 | 0 | 0 |
| 25.10.2016 13:00 - 14:00 | 0 | 0 | 0 | 0 |
| 25.10.2016 14:00 - 15:00 | 0 | 0 | 0 | 0 |
| 25.10.2016 15:00 - 16:00 | 0 | 0 | 0 | 0 |
| 25.10.2016 16:00 - 17:00 | 0 | 0 | 0 | 0 |
| 25.10.2016 17:00 - 18:00 | 0 | 0 | 0 | 0 |
| 25.10.2016 18:00 - 19:00 | 0 | 0 | 0 | 0 |
| 25.10.2016 19:00 - 20:00 | 0 | 0 | 0 | 0 |
| 25.10.2016 20:00 - 21:00 | 0 | 0 | 0 | 0 |
| 25.10.2016 21:00 - 22:00 | 0 | 0 | 0 | 0 |
| 25.10.2016 22:00 - 23:00 | 0 | 0 | 0 | 0 |
| 25.10.2016 23:00 - 24:00 | 0 | 0 | 0 | 0 |
| 26.10.2016 00:00 - 01:00 | 0 | 0 | 0 | 0 |
| 26.10.2016 01:00 - 02:00 | 0 | 0 | 0 | 0 |
| 26.10.2016 02:00 - 03:00 | 0 | 0 | 0 | 0 |
| 26.10.2016 03:00 - 04:00 | 0 | 0 | 0 | 0 |
| 26.10.2016 04:00 - 05:00 | 0 | 0 | 0 | 0 |
| 26.10.2016 05:00 - 06:00 | 0 | 0 | 0 | 0 |
| 26.10.2016 06:00 - 07:00 | 0 | 0 | 0 | 0 |
| 26.10.2016 07:00 - 08:00 | 0 | 0 | 0 | 0 |
| 26.10.2016 08:00 - 09:00 | 0 | 0 | 0 | 0 |
| 26.10.2016 09:00 - 10:00 | 0 | -40 | 0 | 0 |
| 26.10.2016 10:00 - 11:00 | 0 | -40 | 0 | 0 |
| 26.10.2016 11:00 - 12:00 | 0 | -40 | 0 | 0 |
| 26.10.2016 12:00 - 13:00 | 0 | -40 | 0 | 0 |
| 26.10.2016 13:00 - 14:00 | 0 | -90 | 0 | 0 |
| 26.10.2016 14:00 - 15:00 | 0 | -90 | 0 | 0 |
| 26.10.2016 15:00 - 16:00 | 0 | -90 | 0 | 0 |
| 26.10.2016 16:00 - 17:00 | 0 | -90 | 0 | 0 |
| 26.10.2016 17:00 - 18:00 | 0 | -90 | 0 | 0 |
| 26.10.2016 18:00 - 19:00 | 0 | -90 | 0 | 0 |
| 26.10.2016 19:00 - 20:00 | 0 | -90 | 0 | 0 |
| 26.10.2016 20:00 - 21:00 | 0 | -90 | 0 | 0 |
| 26.10.2016 21:00 - 22:00 | 0 | -90 | 0 | 0 |
| 26.10.2016 22:00 - 23:00 | 0 | -90 | 0 | 0 |
| 26.10.2016 23:00 - 24:00 | 0 | -90 | 0 | 0 |
| 27.10.2016 00:00 - 01:00 | 0 | -90 | 0 | 0 |
| 27.10.2016 01:00 - 02:00 | 0 | -90 | 0 | 0 |
| 27.10.2016 02:00 - 03:00 | 0 | -90 | 0 | 0 |
| 27.10.2016 03:00 - 04:00 | 200 | -90 | 0 | 0 |
| 27.10.2016 04:00 - 05:00 | 200 | -90 | 0 | 0 |
| 27.10.2016 05:00 - 06:00 | 200 | -90 | 0 | 0 |
| 27.10.2016 06:00 - 07:00 | 0 | 0 | 0 | 0 |
| 27.10.2016 07:00 - 08:00 | 0 | 0 | 0 | 0 |
| 27.10.2016 08:00 - 09:00 | 0 | 0 | 0 | 0 |
| 27.10.2016 09:00 - 10:00 | 0 | 0 | 0 | 0 |
| 27.10.2016 10:00 - 11:00 | 0 | 0 | 0 | 0 |
| 27.10.2016 11:00 - 12:00 | 0 | 0 | 0 | 0 |
| 27.10.2016 12:00 - 13:00 | 0 | 0 | 0 | 0 |
| 27.10.2016 13:00 - 14:00 | 0 | 0 | 0 | 0 |
| 27.10.2016 14:00 - 15:00 | 0 | 0 | 0 | 0 |
| 27.10.2016 15:00 - 16:00 | 0 | 0 | 0 | 0 |
| 27.10.2016 16:00 - 17:00 | 0 | 0 | 0 | 0 |
| 27.10.2016 17:00 - 18:00 | 0 | 0 | 0 | 0 |
| 27.10.2016 18:00 - 19:00 | 0 | 0 | 0 | 0 |
| 27.10.2016 19:00 - 20:00 | 0 | 0 | 0 | 0 |
| 27.10.2016 20:00 - 21:00 | 0 | 0 | 0 | 0 |
| 27.10.2016 21:00 - 22:00 | 0 | 0 | 0 | 0 |
| 27.10.2016 22:00 - 23:00 | 0 | 0 | 0 | 0 |
| 27.10.2016 23:00 - 24:00 | 0 | 0 | 0 | 0 |
| 28.10.2016 00:00 - 01:00 | 0 | 0 | 0 | 0 |
| 28.10.2016 01:00 - 02:00 | 0 | 0 | 0 | 0 |
| 28.10.2016 02:00 - 03:00 | 0 | 0 | 0 | 0 |
| 28.10.2016 03:00 - 04:00 | 0 | 0 | 0 | 0 |
| 28.10.2016 04:00 - 05:00 | 0 | 0 | 0 | 0 |
| 28.10.2016 05:00 - 06:00 | 0 | 0 | 0 | 0 |
| 28.10.2016 06:00 - 07:00 | 0 | 0 | 0 | 0 |
| 28.10.2016 07:00 - 08:00 | 0 | 0 | 0 | 0 |
| 28.10.2016 08:00 - 09:00 | 0 | 0 | 0 | 0 |
| 28.10.2016 09:00 - 10:00 | 0 | 0 | 0 | 0 |
| 28.10.2016 10:00 - 11:00 | 0 | 0 | 0 | 0 |
| 28.10.2016 11:00 - 12:00 | 0 | 0 | 0 | 0 |
| 28.10.2016 12:00 - 13:00 | 0 | 0 | 0 | 0 |
| 28.10.2016 13:00 - 14:00 | 0 | 0 | 0 | 0 |
| 28.10.2016 14:00 - 15:00 | 0 | 0 | 0 | 0 |
| 28.10.2016 15:00 - 16:00 | 0 | 0 | 0 | 0 |
| 28.10.2016 16:00 - 17:00 | 0 | 0 | 0 | 0 |
| 28.10.2016 17:00 - 18:00 | 30 | 0 | 0 | 0 |
| 28.10.2016 18:00 - 19:00 | 30 | 0 | 0 | 0 |
| 28.10.2016 19:00 - 20:00 | 30 | 0 | 0 | 0 |
| 28.10.2016 20:00 - 21:00 | 30 | 0 | 0 | 0 |
| 28.10.2016 21:00 - 22:00 | 30 | 0 | 0 | 0 |
| 28.10.2016 22:00 - 23:00 | 30 | 0 | 0 | 0 |
| 28.10.2016 23:00 - 24:00 | 30 | 0 | 0 | 0 |
| 29.10.2016 00:00 - 01:00 | 30 | 0 | 0 | 0 |
| 29.10.2016 01:00 - 02:00 | 30 | 0 | 0 | 0 |
| 29.10.2016 02:00 - 03:00 | 30 | 0 | 0 | 0 |
| 29.10.2016 03:00 - 04:00 | 100 | 0 | 0 | 0 |
| 29.10.2016 04:00 - 05:00 | 100 | 0 | 0 | 0 |
| 29.10.2016 05:00 - 06:00 | 100 | 0 | 0 | 0 |
| 29.10.2016 06:00 - 07:00 | 0 | 0 | 0 | 0 |
| 29.10.2016 07:00 - 08:00 | 0 | 0 | 0 | 0 |
| 29.10.2016 08:00 - 09:00 | 0 | 0 | 0 | 0 |
| 29.10.2016 09:00 - 10:00 | 0 | 0 | 0 | 0 |
| 29.10.2016 10:00 - 11:00 | 0 | 0 | 0 | 0 |
| 29.10.2016 11:00 - 12:00 | 0 | 0 | 0 | 0 |
| 29.10.2016 12:00 - 13:00 | 0 | 0 | 0 | 0 |
| 29.10.2016 13:00 - 14:00 | 0 | 0 | 0 | 0 |
| 29.10.2016 14:00 - 15:00 | 0 | 0 | 0 | 0 |
| 29.10.2016 15:00 - 16:00 | 0 | 0 | 0 | 0 |
| 29.10.2016 16:00 - 17:00 | 50 | 0 | 0 | 0 |
| 29.10.2016 17:00 - 18:00 | 50 | 0 | 0 | 0 |
| 29.10.2016 18:00 - 19:00 | 50 | 0 | 0 | 0 |
| 29.10.2016 19:00 - 20:00 | 50 | 0 | 0 | 0 |
| 29.10.2016 20:00 - 21:00 | 50 | 0 | 0 | 0 |
| 29.10.2016 21:00 - 22:00 | 50 | 0 | 0 | 0 |
| 29.10.2016 22:00 - 23:00 | 50 | 0 | 0 | 0 |
| 29.10.2016 23:00 - 24:00 | 50 | 0 | 0 | 0 |
| 30.10.2016 00:00 - 01:00 | 50 | 0 | 0 | 0 |
| 30.10.2016 01:00 - 02:00 | 50 | 0 | 0 | 0 |
| 30.10.2016 02:00 - 03:00 | 50 | 0 | 0 | 0 |
| 30.10.2016 02:00 - 03:00 | 50 | 0 | 0 | 0 |
| 30.10.2016 03:00 - 04:00 | 50 | 0 | 0 | 0 |
| 30.10.2016 04:00 - 05:00 | 50 | 0 | 0 | 0 |
| 30.10.2016 05:00 - 06:00 | 50 | 0 | 0 | 0 |
| 30.10.2016 06:00 - 07:00 | 0 | 0 | 0 | 0 |
| 30.10.2016 07:00 - 08:00 | 0 | 0 | 0 | 0 |
| 30.10.2016 08:00 - 09:00 | 0 | 0 | 0 | 0 |
| 30.10.2016 09:00 - 10:00 | 0 | 0 | 0 | 0 |
| 30.10.2016 10:00 - 11:00 | 0 | 0 | 0 | 0 |
| 30.10.2016 11:00 - 12:00 | 0 | 0 | 0 | 0 |
| 30.10.2016 12:00 - 13:00 | 0 | 0 | 0 | 0 |
| 30.10.2016 13:00 - 14:00 | 0 | 0 | 0 | 0 |
| 30.10.2016 14:00 - 15:00 | 0 | 0 | 0 | 0 |
| 30.10.2016 15:00 - 16:00 | 0 | 0 | 0 | 0 |
| 30.10.2016 16:00 - 17:00 | 0 | 0 | 0 | 0 |
| 30.10.2016 17:00 - 18:00 | 0 | 0 | 0 | 0 |
| 30.10.2016 18:00 - 19:00 | 0 | 0 | 0 | 0 |
| 30.10.2016 19:00 - 20:00 | 0 | 0 | 0 | 0 |
| 30.10.2016 20:00 - 21:00 | 0 | 0 | 0 | 0 |
| 30.10.2016 21:00 - 22:00 | 0 | 0 | 0 | 0 |
| 30.10.2016 22:00 - 23:00 | 0 | 0 | 0 | 0 |
| 30.10.2016 23:00 - 24:00 | 0 | 0 | 0 | 0 |
| 31.10.2016 00:00 - 01:00 | 0 | 0 | 0 | 0 |
| 31.10.2016 01:00 - 02:00 | 0 | 0 | 0 | 0 |
| 31.10.2016 02:00 - 03:00 | 0 | 0 | 0 | 0 |
| 31.10.2016 03:00 - 04:00 | 0 | 0 | 0 | 0 |
| 31.10.2016 04:00 - 05:00 | 0 | 0 | 0 | 0 |
| 31.10.2016 05:00 - 06:00 | 0 | 0 | 0 | 0 |
| 31.10.2016 06:00 - 07:00 | 0 | 0 | 0 | 0 |